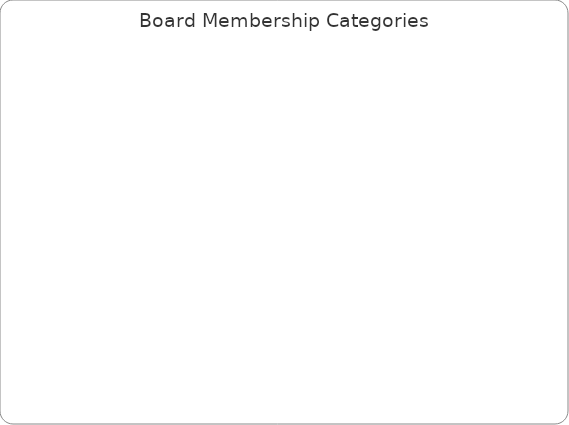
| Category | Series 0 |
|---|---|
| Business | 0 |
| Workforce | 0 |
| Education | 0 |
| Government | 0 |
| Optional Members | 0 |